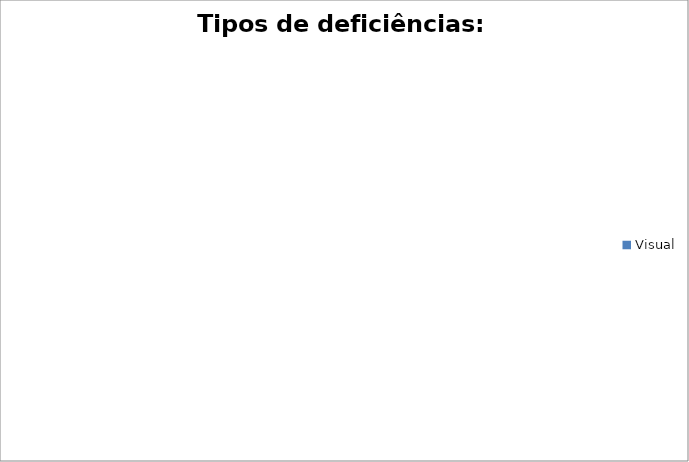
| Category | Tipos de deficiências: Quantitativo |
|---|---|
| Visual  | 0 |